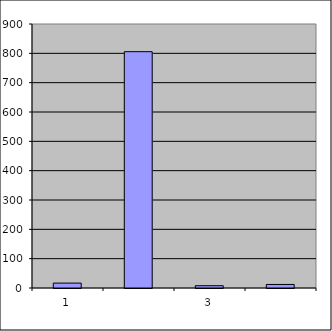
| Category | Series 0 |
|---|---|
| 0 | 16.75 |
| 1 | 805.664 |
| 2 | 7.799 |
| 3 | 12.087 |